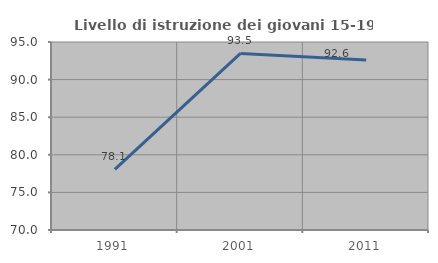
| Category | Livello di istruzione dei giovani 15-19 anni |
|---|---|
| 1991.0 | 78.057 |
| 2001.0 | 93.483 |
| 2011.0 | 92.593 |